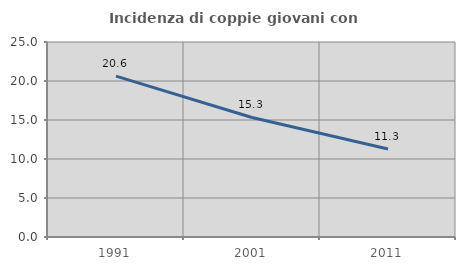
| Category | Incidenza di coppie giovani con figli |
|---|---|
| 1991.0 | 20.621 |
| 2001.0 | 15.325 |
| 2011.0 | 11.286 |